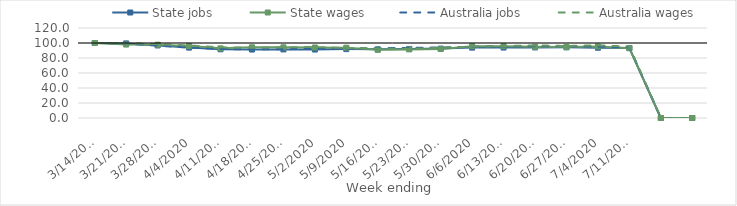
| Category | State jobs | State wages | Australia jobs | Australia wages |
|---|---|---|---|---|
| 14/03/2020 | 100 | 100 | 100 | 100 |
| 21/03/2020 | 99.463 | 97.898 | 99.345 | 99.743 |
| 28/03/2020 | 96.718 | 97.73 | 96.491 | 98.481 |
| 04/04/2020 | 93.856 | 96.044 | 93.819 | 96.778 |
| 11/04/2020 | 91.642 | 92.86 | 91.996 | 94.184 |
| 18/04/2020 | 91.285 | 94.305 | 91.451 | 94.032 |
| 25/04/2020 | 91.431 | 94.278 | 91.738 | 94.241 |
| 02/05/2020 | 91.277 | 94.007 | 92.109 | 94.689 |
| 09/05/2020 | 91.867 | 93.77 | 92.629 | 93.316 |
| 16/05/2020 | 91.561 | 90.934 | 93.158 | 92.67 |
| 23/05/2020 | 92.085 | 91.484 | 93.449 | 92.26 |
| 30/05/2020 | 92.54 | 91.927 | 94.006 | 93.552 |
| 06/06/2020 | 93.846 | 95.688 | 94.942 | 95.15 |
| 13/06/2020 | 93.938 | 95.71 | 95.443 | 95.811 |
| 20/06/2020 | 94.075 | 94.902 | 95.785 | 96.851 |
| 27/06/2020 | 94.173 | 94.706 | 95.571 | 95.974 |
| 04/07/2020 | 93.683 | 95.413 | 95.033 | 96.971 |
| 11/07/2020 | 93.23 | 93.112 | 94.423 | 95.167 |